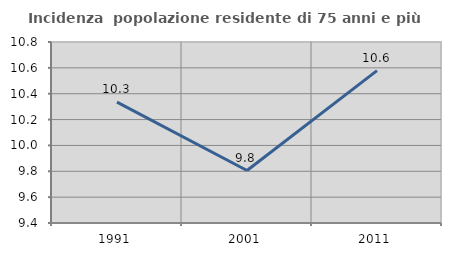
| Category | Incidenza  popolazione residente di 75 anni e più |
|---|---|
| 1991.0 | 10.334 |
| 2001.0 | 9.806 |
| 2011.0 | 10.578 |